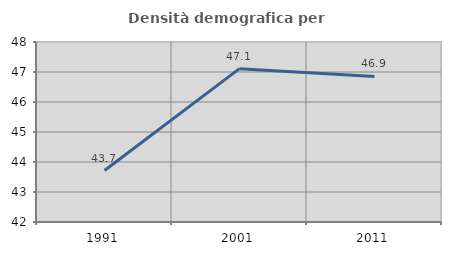
| Category | Densità demografica |
|---|---|
| 1991.0 | 43.716 |
| 2001.0 | 47.112 |
| 2011.0 | 46.851 |